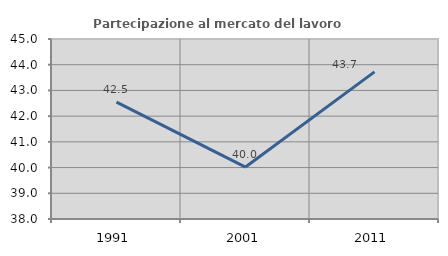
| Category | Partecipazione al mercato del lavoro  femminile |
|---|---|
| 1991.0 | 42.547 |
| 2001.0 | 40.02 |
| 2011.0 | 43.723 |